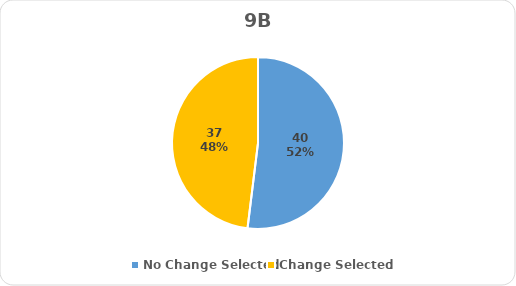
| Category | Series 0 |
|---|---|
| No Change Selected | 40 |
| Change Selected | 37 |